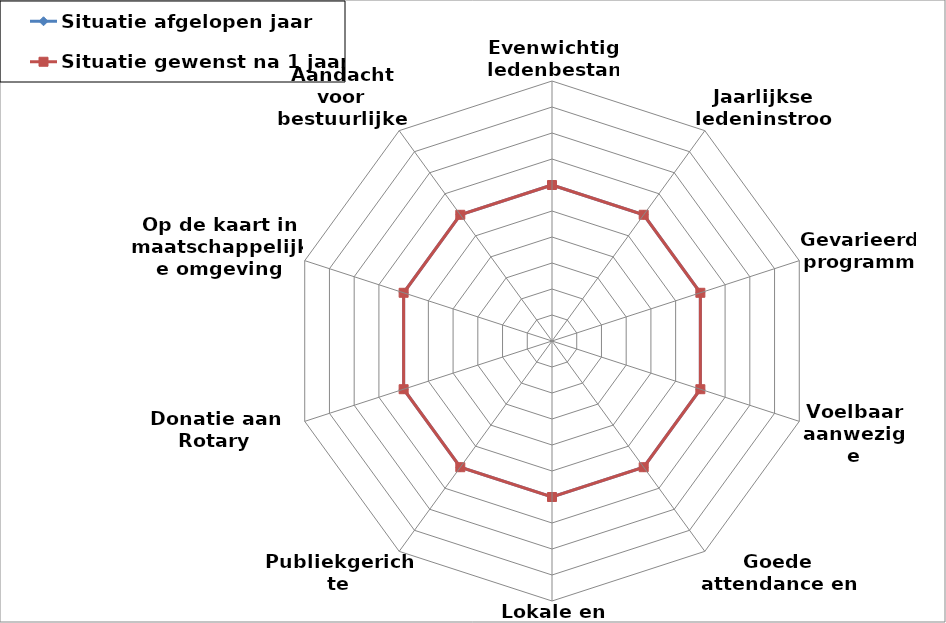
| Category | Situatie afgelopen jaar | Situatie gewenst na 1 jaar |
|---|---|---|
| Evenwichtig ledenbestand | 6 | 6 |
| Jaarlijkse ledeninstroom | 6 | 6 |
| Gevarieerd programma | 6 | 6 |
| Voelbaar aanwezige fellowship | 6 | 6 |
| Goede attendance en betrokkenheid | 6 | 6 |
| Lokale en internationale projecten | 6 | 6 |
| Publiekgerichte fondswerving | 6 | 6 |
| Donatie aan Rotary Foundation | 6 | 6 |
| Op de kaart in maatschappelijke omgeving | 6 | 6 |
| Aandacht voor bestuurlijke continuïteit | 6 | 6 |